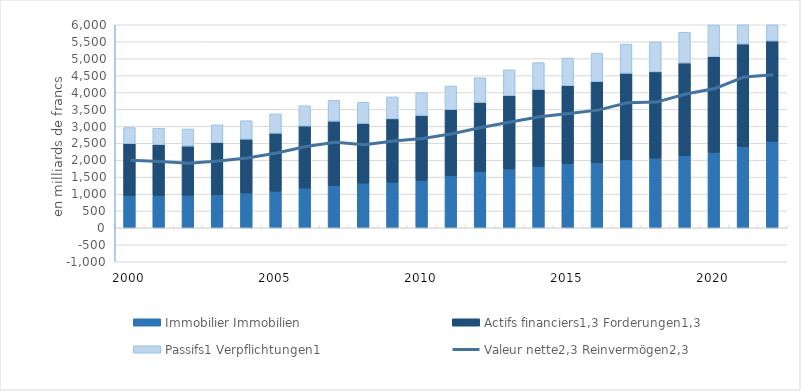
| Category | Immobilier | Actifs financiers1,3 | Passifs1 |
|---|---|---|---|
| 2000.0 | 947.095 | 1538.481 | 479.563 |
| 2001.0 | 950.789 | 1507.027 | 487.14 |
| 2002.0 | 962.124 | 1455.705 | 503.652 |
| 2003.0 | 976.581 | 1537.914 | 530.495 |
| 2004.0 | 1030.122 | 1591.15 | 546.417 |
| 2005.0 | 1082.69 | 1713.176 | 573.965 |
| 2006.0 | 1174.518 | 1835.329 | 598.822 |
| 2007.0 | 1250.969 | 1901.689 | 614.781 |
| 2008.0 | 1320.921 | 1765.171 | 625.623 |
| 2009.0 | 1346.191 | 1875.423 | 648.469 |
| 2010.0 | 1406.484 | 1913.624 | 673.438 |
| 2011.0 | 1535.51 | 1955.056 | 702.428 |
| 2012.0 | 1656.19 | 2049.594 | 730.633 |
| 2013.0 | 1736.058 | 2166.896 | 765.52 |
| 2014.0 | 1816.386 | 2269.891 | 795.546 |
| 2015.0 | 1892.804 | 2309.606 | 815.682 |
| 2016.0 | 1920.802 | 2402.434 | 837.488 |
| 2017.0 | 2008.192 | 2559.235 | 862.489 |
| 2018.0 | 2060.154 | 2549.082 | 886.957 |
| 2019.0 | 2130.904 | 2740.441 | 908.479 |
| 2020.0 | 2224.836 | 2835.153 | 935.578 |
| 2021.0 | 2401.95 | 3030.004 | 965.625 |
| 2022.0 | 2550.119 | 2972.061 | 993.844 |